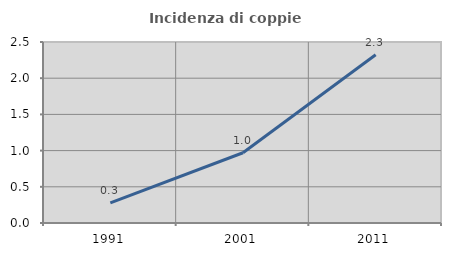
| Category | Incidenza di coppie miste |
|---|---|
| 1991.0 | 0.278 |
| 2001.0 | 0.97 |
| 2011.0 | 2.323 |